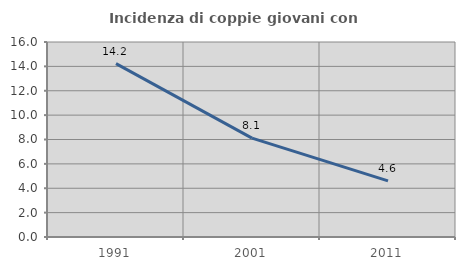
| Category | Incidenza di coppie giovani con figli |
|---|---|
| 1991.0 | 14.229 |
| 2001.0 | 8.115 |
| 2011.0 | 4.607 |